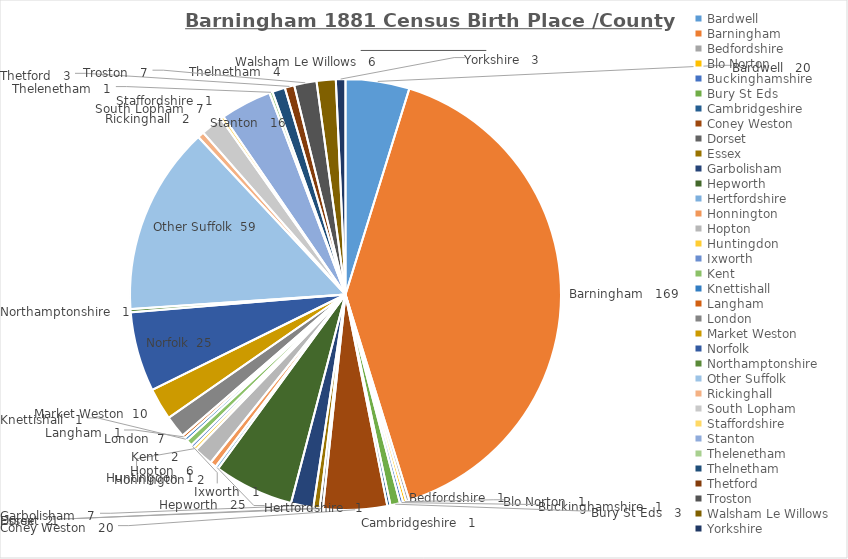
| Category | Birthplace /County Distribution |
|---|---|
| Bardwell   | 20 |
| Barningham   | 169 |
| Bedfordshire   | 1 |
| Blo Norton   | 1 |
| Buckinghamshire   | 1 |
| Bury St Eds   | 3 |
| Cambridgeshire   | 1 |
| Coney Weston   | 20 |
| Dorset   | 1 |
| Essex   | 2 |
| Garbolisham   | 7 |
| Hepworth   | 25 |
| Hertfordshire   | 1 |
| Honnington   | 2 |
| Hopton   | 6 |
| Huntingdon  | 1 |
| Ixworth   | 1 |
| Kent   | 2 |
| Knettishall   | 1 |
| Langham   | 1 |
| London  | 7 |
| Market Weston  | 10 |
| Norfolk  | 25 |
| Northamptonshire   | 1 |
| Other Suffolk  | 59 |
| Rickinghall   | 2 |
| South Lopham   | 7 |
| Staffordshire   | 1 |
| Stanton   | 16 |
| Thelenetham   | 1 |
| Thelnetham   | 4 |
| Thetford   | 3 |
| Troston   | 7 |
| Walsham Le Willows   | 6 |
| Yorkshire   | 3 |